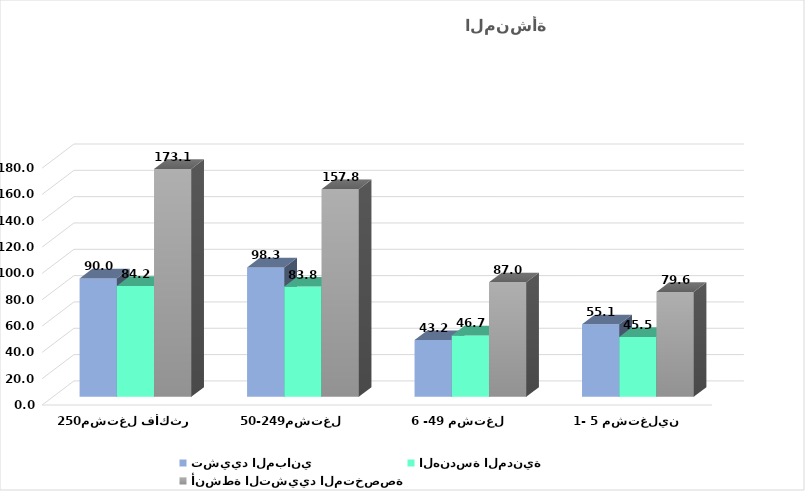
| Category | تشييد المباني | الهندسة المدنية | أنشطة التشييد المتخصصة |
|---|---|---|---|
| 1- 5 مشتغلين | 55.117 | 45.481 | 79.635 |
| 6 -49 مشتغل | 43.16 | 46.652 | 86.966 |
| 50-249مشتغل | 98.276 | 83.794 | 157.754 |
| 250مشتغل فأكثر | 89.978 | 84.223 | 173.117 |